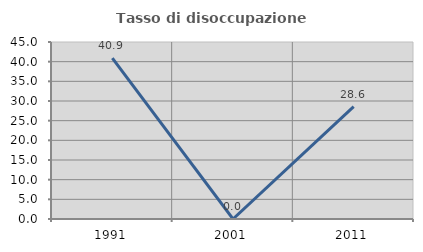
| Category | Tasso di disoccupazione giovanile  |
|---|---|
| 1991.0 | 40.909 |
| 2001.0 | 0 |
| 2011.0 | 28.571 |